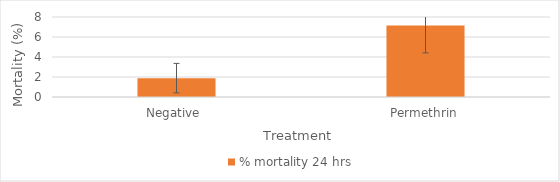
| Category | % mortality 24 hrs |
|---|---|
| Negative  | 1.887 |
| Permethrin | 7.143 |